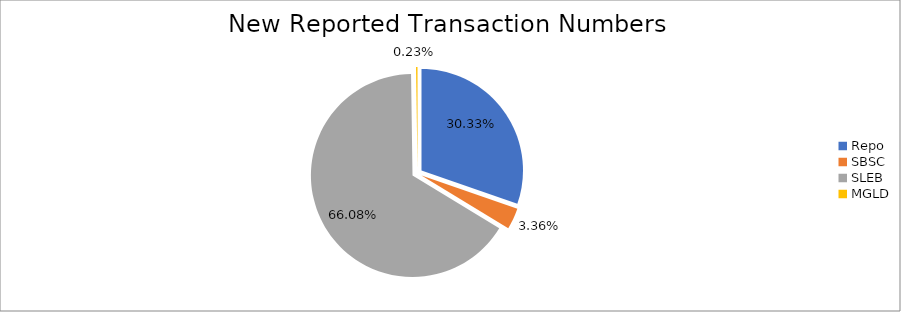
| Category | Series 0 |
|---|---|
| Repo | 426234 |
| SBSC | 47213 |
| SLEB | 928575 |
| MGLD | 3197 |